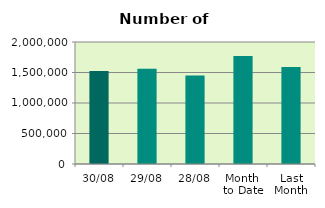
| Category | Series 0 |
|---|---|
| 30/08 | 1523956 |
| 29/08 | 1563356 |
| 28/08 | 1451454 |
| Month 
to Date | 1768562.909 |
| Last
Month | 1591495.826 |